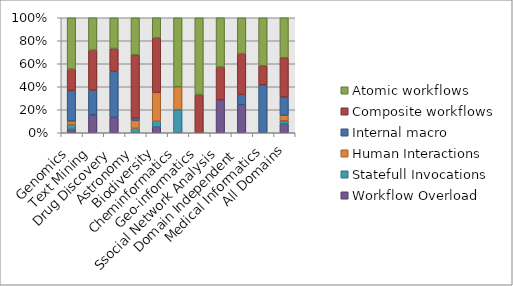
| Category | Workflow Overload | Statefull Invocations | Human Interactions | Internal macro | Composite workflows | Atomic workflows |
|---|---|---|---|---|---|---|
| Genomics | 4 | 6 | 4 | 37 | 26 | 62 |
| Text Mining | 14 | 0 | 0 | 19 | 31 | 25 |
| Drug Discovery | 2 | 0 | 0 | 6 | 3 | 4 |
| Astronomy | 0 | 4 | 7 | 2 | 57 | 33 |
| Biodiversity | 2 | 2 | 10 | 0 | 19 | 7 |
| Cheminformatics | 0 | 1 | 1 | 0 | 0 | 3 |
| Geo-informatics | 0 | 0 | 0 | 0 | 2 | 4 |
| Ssocial Network Analysis | 2 | 0 | 0 | 0 | 2 | 3 |
| Domain Independent | 11 | 0 | 0 | 4 | 16 | 14 |
| Medical Informatics | 0 | 0 | 0 | 5 | 2 | 5 |
| All Domains | 35 | 13 | 22 | 73 | 158 | 160 |